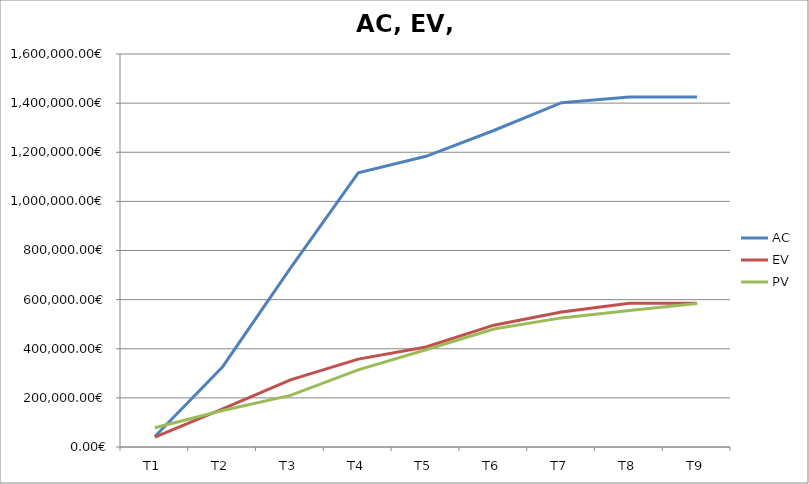
| Category | AC | EV | PV |
|---|---|---|---|
| T1 | 42494.401 | 40315.201 | 78451.201 |
| T2 | 326880.005 | 155283.784 | 148730.402 |
| T3 | 728370.371 | 273070.312 | 210183.843 |
| T4 | 1116295.217 | 357801.946 | 313804.805 |
| T5 | 1183428.198 | 407330.943 | 395851.686 |
| T6 | 1288520.119 | 496040.407 | 480186.727 |
| T7 | 1401947.481 | 549212.888 | 525623.048 |
| T8 | 1425155.961 | 584951.769 | 555532.568 |
| T9 | 1425155.961 | 584951.769 | 584298.009 |